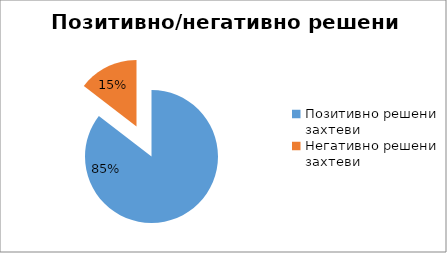
| Category | Series 0 |
|---|---|
| Позитивно решени захтеви | 43420 |
| Негативно решени захтеви | 7390 |